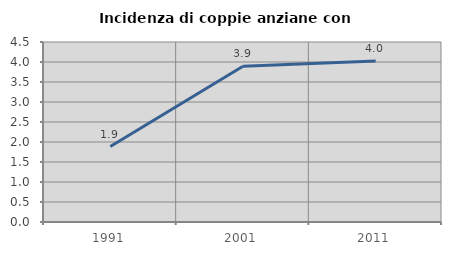
| Category | Incidenza di coppie anziane con figli |
|---|---|
| 1991.0 | 1.886 |
| 2001.0 | 3.893 |
| 2011.0 | 4.027 |